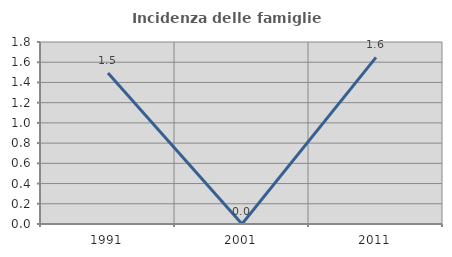
| Category | Incidenza delle famiglie numerose |
|---|---|
| 1991.0 | 1.493 |
| 2001.0 | 0 |
| 2011.0 | 1.648 |